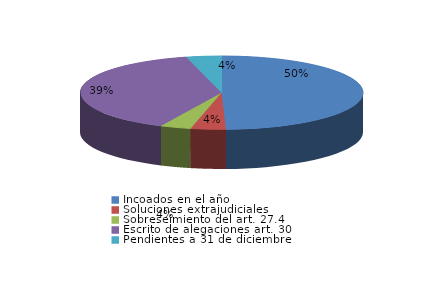
| Category | Series 0 |
|---|---|
| Incoados en el año | 99 |
| Soluciones extrajudiciales | 8 |
| Sobreseimiento del art. 27.4 | 7 |
| Escrito de alegaciones art. 30 | 78 |
| Pendientes a 31 de diciembre | 8 |